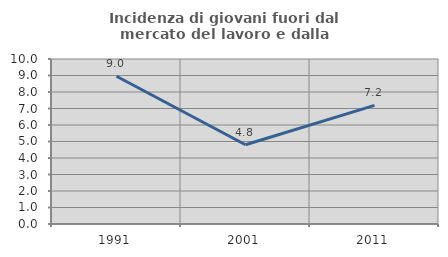
| Category | Incidenza di giovani fuori dal mercato del lavoro e dalla formazione  |
|---|---|
| 1991.0 | 8.953 |
| 2001.0 | 4.805 |
| 2011.0 | 7.187 |